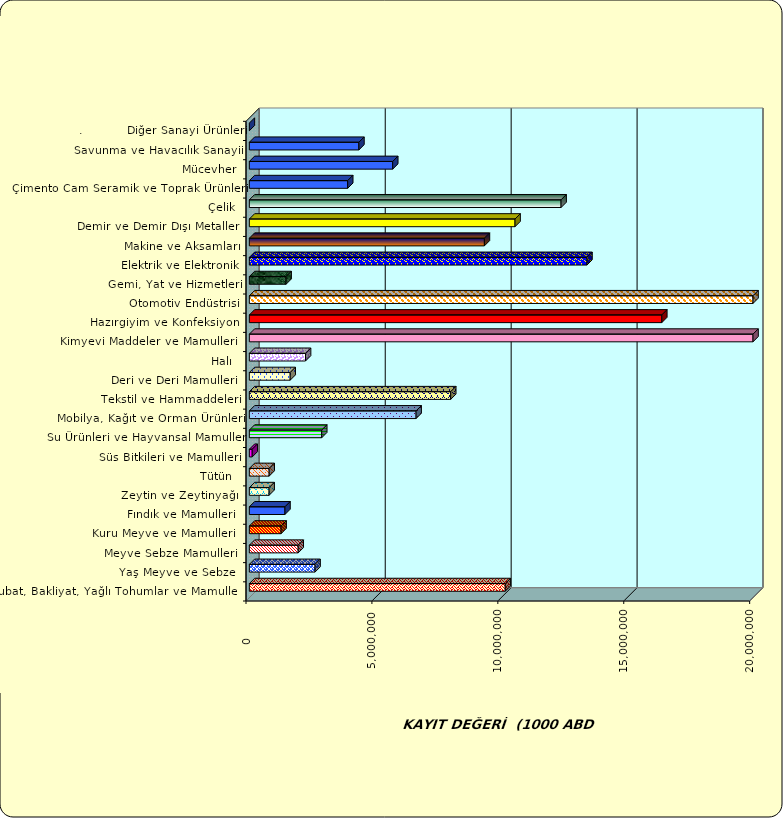
| Category | Series 0 |
|---|---|
|  Hububat, Bakliyat, Yağlı Tohumlar ve Mamulleri  | 10162200.976 |
|  Yaş Meyve ve Sebze   | 2608816.392 |
|  Meyve Sebze Mamulleri  | 1940027.245 |
|  Kuru Meyve ve Mamulleri   | 1260097.202 |
|  Fındık ve Mamulleri  | 1414103.709 |
|  Zeytin ve Zeytinyağı  | 784629.58 |
|  Tütün  | 787233.863 |
|  Süs Bitkileri ve Mamulleri | 113993.618 |
|  Su Ürünleri ve Hayvansal Mamuller | 2874056.812 |
|  Mobilya, Kağıt ve Orman Ürünleri | 6621359.616 |
|  Tekstil ve Hammaddeleri | 7995649.249 |
|  Deri ve Deri Mamulleri  | 1621892.514 |
|  Halı  | 2230821.943 |
|  Kimyevi Maddeler ve Mamulleri   | 24991733.821 |
|  Hazırgiyim ve Konfeksiyon  | 16377866.96 |
|  Otomotiv Endüstrisi | 28666704.54 |
|  Gemi, Yat ve Hizmetleri | 1458502.393 |
|  Elektrik ve Elektronik | 13406198.7 |
|  Makine ve Aksamları | 9333156.522 |
|  Demir ve Demir Dışı Metaller  | 10550285.822 |
|  Çelik | 12378242.672 |
|  Çimento Cam Seramik ve Toprak Ürünleri | 3904739.792 |
|  Mücevher | 5692920.249 |
|  Savunma ve Havacılık Sanayii | 4350275.619 |
| .           Diğer Sanayi Ürünleri | 0 |